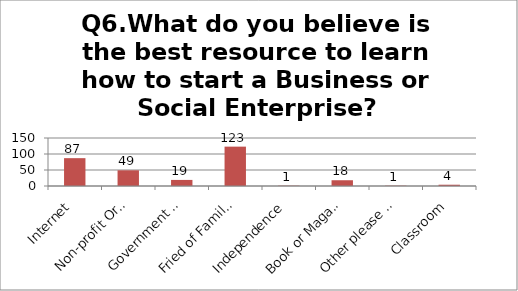
| Category | Q6.What do you believe is the best resource to learn how to start a Business or Social Enterprise? |
|---|---|
| Internet | 87 |
| Non-profit Organization | 49 |
| Government Sources | 19 |
| Fried of Family Member | 123 |
| Independence | 1 |
| Book or Magazine | 18 |
| Other please specify | 1 |
| Classroom | 4 |